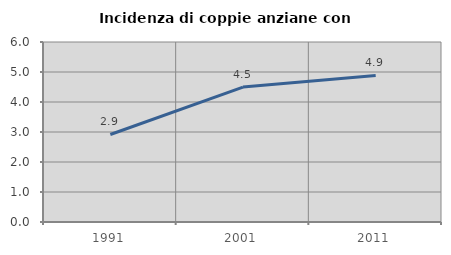
| Category | Incidenza di coppie anziane con figli |
|---|---|
| 1991.0 | 2.918 |
| 2001.0 | 4.497 |
| 2011.0 | 4.885 |